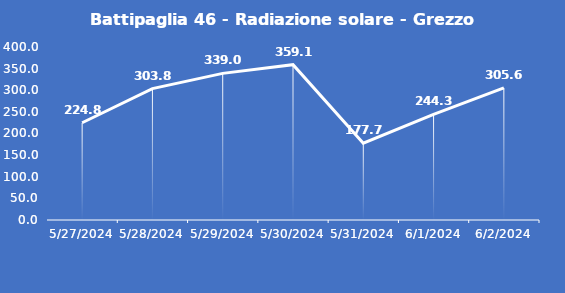
| Category | Battipaglia 46 - Radiazione solare - Grezzo (W/m2) |
|---|---|
| 5/27/24 | 224.8 |
| 5/28/24 | 303.8 |
| 5/29/24 | 339 |
| 5/30/24 | 359.1 |
| 5/31/24 | 177.7 |
| 6/1/24 | 244.3 |
| 6/2/24 | 305.6 |